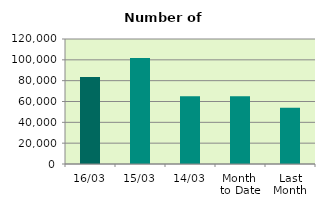
| Category | Series 0 |
|---|---|
| 16/03 | 83590 |
| 15/03 | 101698 |
| 14/03 | 65056 |
| Month 
to Date | 65065.5 |
| Last
Month | 54034.8 |